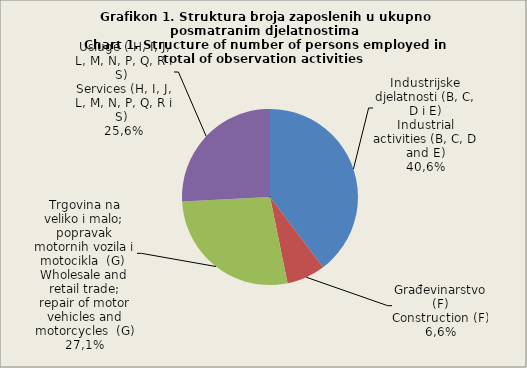
| Category | Broj zaposlenih osoba
Number of persons employed
  0 |
|---|---|
| Industrijske djelatnosti (B, C, D i E)
Industrial activities (B, C, D and E) | 39.7 |
| Građevinarstvo (F)
Construction (F) | 7.1 |
| Trgovina na veliko i malo; popravak motornih vozila i motocikla  (G) 
Wholesale and retail trade; repair of motor vehicles and motorcycles  (G)
 | 27.4 |
| Usluge 
Services  | 25.8 |